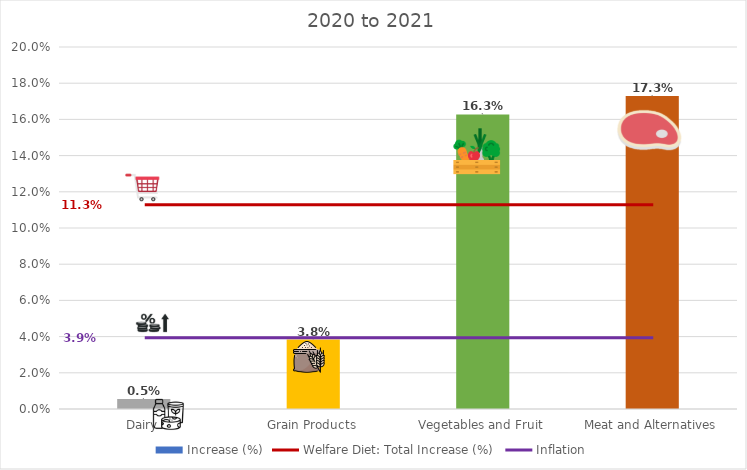
| Category | Increase (%) |
|---|---|
| Dairy | 0.005 |
| Grain Products | 0.038 |
| Vegetables and Fruit | 0.163 |
| Meat and Alternatives | 0.173 |